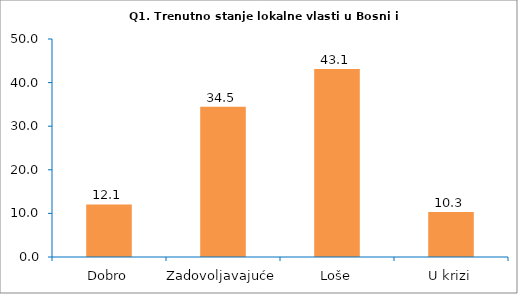
| Category | Series 0 |
|---|---|
| Dobro | 12.069 |
| Zadovoljavajuće | 34.483 |
| Loše | 43.103 |
| U krizi | 10.345 |